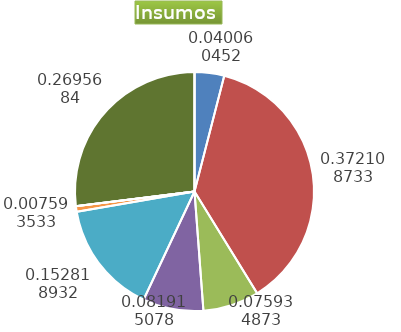
| Category | Series 0 |
|---|---|
| Control arvenses | 209415 |
| Control fitosanitario | 1945189 |
| Cosecha y beneficio | 396947.629 |
| Fertilización | 428209 |
| Instalación | 798857.104 |
| Otros | 39695 |
| Podas | 0 |
| Riego | 0 |
| Transporte | 1409162 |
| Tutorado | 0 |